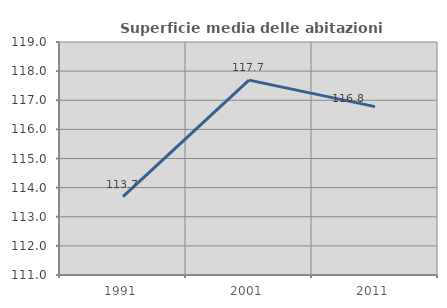
| Category | Superficie media delle abitazioni occupate |
|---|---|
| 1991.0 | 113.689 |
| 2001.0 | 117.69 |
| 2011.0 | 116.78 |